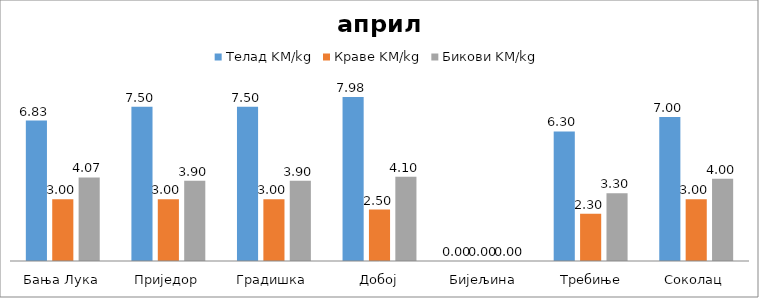
| Category | Телад KM/kg | Краве KM/kg | Бикови KM/kg |
|---|---|---|---|
| Бања Лука | 6.833 | 3 | 4.067 |
| Приједор | 7.5 | 3 | 3.9 |
| Градишка | 7.5 | 3 | 3.9 |
| Добој | 7.975 | 2.5 | 4.1 |
| Бијељина | 0 | 0 | 0 |
|  Требиње | 6.3 | 2.3 | 3.3 |
| Соколац | 7 | 3 | 4 |